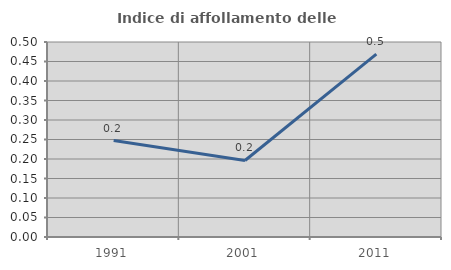
| Category | Indice di affollamento delle abitazioni  |
|---|---|
| 1991.0 | 0.247 |
| 2001.0 | 0.196 |
| 2011.0 | 0.469 |